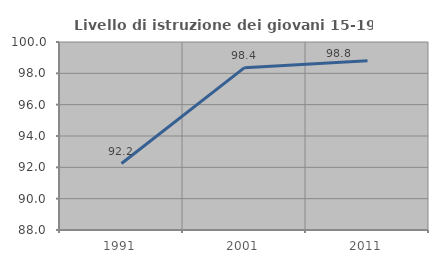
| Category | Livello di istruzione dei giovani 15-19 anni |
|---|---|
| 1991.0 | 92.241 |
| 2001.0 | 98.361 |
| 2011.0 | 98.81 |